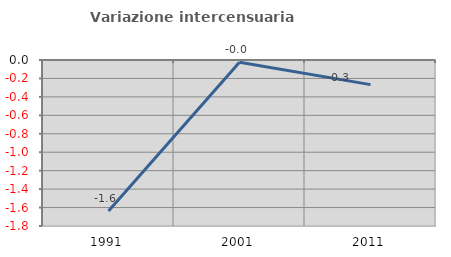
| Category | Variazione intercensuaria annua |
|---|---|
| 1991.0 | -1.637 |
| 2001.0 | -0.024 |
| 2011.0 | -0.267 |